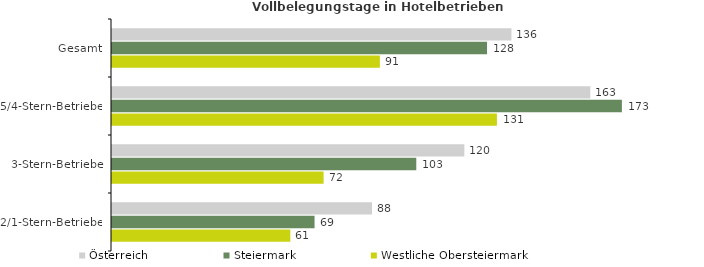
| Category | Österreich | Steiermark | Westliche Obersteiermark |
|---|---|---|---|
| Gesamt | 135.866 | 127.561 | 91.118 |
| 5/4-Stern-Betriebe | 162.683 | 173.435 | 130.926 |
| 3-Stern-Betriebe | 119.851 | 103.499 | 71.966 |
| 2/1-Stern-Betriebe | 88.435 | 68.894 | 60.657 |